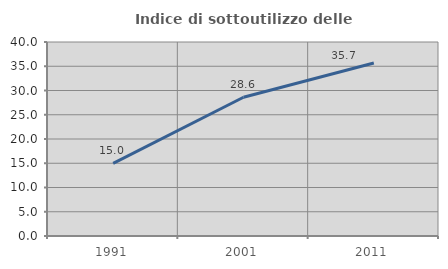
| Category | Indice di sottoutilizzo delle abitazioni  |
|---|---|
| 1991.0 | 14.957 |
| 2001.0 | 28.603 |
| 2011.0 | 35.683 |